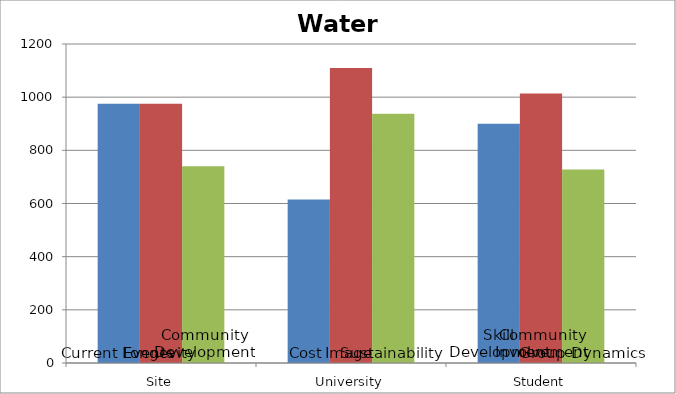
| Category | Alignment1 | Alignment2 | Alignment3 |
|---|---|---|---|
| 0 | 975 | 975 | 740 |
| 1 | 615 | 1110 | 937.5 |
| 2 | 900 | 1013.75 | 727.5 |